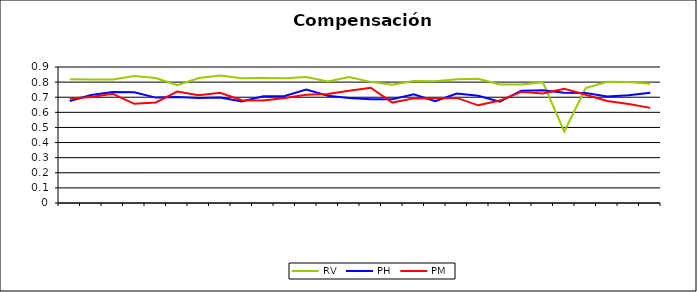
| Category | RV | PH | PM |
|---|---|---|---|
| 0 | 0.819 | 0.675 | 0.691 |
| 1 | 0.818 | 0.714 | 0.701 |
| 2 | 0.817 | 0.734 | 0.722 |
| 3 | 0.84 | 0.732 | 0.656 |
| 4 | 0.827 | 0.697 | 0.666 |
| 5 | 0.78 | 0.701 | 0.737 |
| 6 | 0.827 | 0.695 | 0.713 |
| 7 | 0.844 | 0.699 | 0.73 |
| 8 | 0.826 | 0.672 | 0.68 |
| 9 | 0.827 | 0.706 | 0.678 |
| 10 | 0.826 | 0.709 | 0.696 |
| 11 | 0.834 | 0.751 | 0.717 |
| 12 | 0.804 | 0.709 | 0.721 |
| 13 | 0.834 | 0.694 | 0.743 |
| 14 | 0.802 | 0.687 | 0.763 |
| 15 | 0.783 | 0.687 | 0.665 |
| 16 | 0.807 | 0.72 | 0.692 |
| 17 | 0.805 | 0.674 | 0.693 |
| 18 | 0.82 | 0.724 | 0.695 |
| 19 | 0.822 | 0.71 | 0.646 |
| 20 | 0.784 | 0.67 | 0.678 |
| 21 | 0.785 | 0.743 | 0.736 |
| 22 | 0.8 | 0.745 | 0.725 |
| 23 | 0.473 | 0.729 | 0.756 |
| 24 | 0.76 | 0.727 | 0.716 |
| 25 | 0.802 | 0.705 | 0.675 |
| 26 | 0.801 | 0.713 | 0.656 |
| 27 | 0.788 | 0.729 | 0.629 |